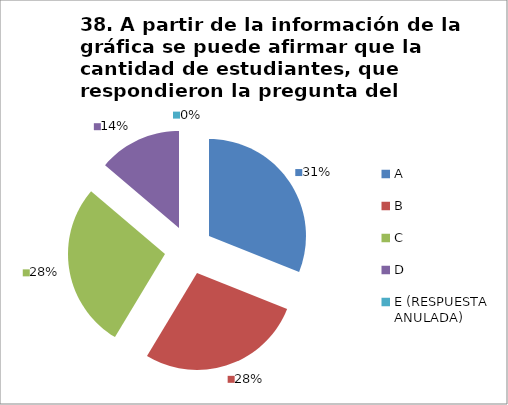
| Category | CANTIDAD DE RESPUESTAS PREGUNTA (38) | PORCENTAJE |
|---|---|---|
| A | 9 | 0.31 |
| B | 8 | 0.276 |
| C | 8 | 0.276 |
| D | 4 | 0.138 |
| E (RESPUESTA ANULADA) | 0 | 0 |